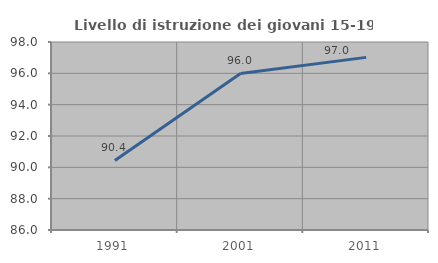
| Category | Livello di istruzione dei giovani 15-19 anni |
|---|---|
| 1991.0 | 90.443 |
| 2001.0 | 95.99 |
| 2011.0 | 97.019 |